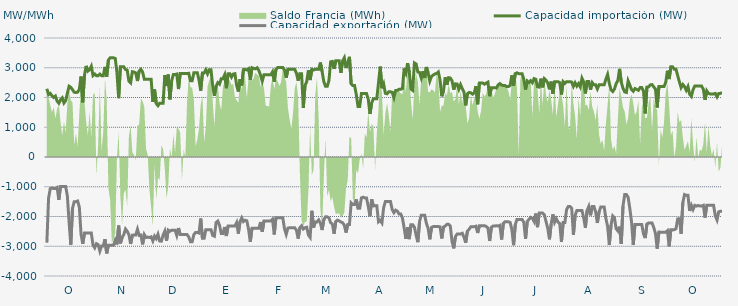
| Category | Capacidad importación (MW) | Capacidad exportación (MW) |
|---|---|---|
| 0 | 2293.75 | -2879.167 |
| 1900-01-01 | 2097.917 | -1387.5 |
| 1900-01-02 | 2137.5 | -1062.5 |
| 1900-01-03 | 2058.333 | -1041.667 |
| 1900-01-04 | 2002.083 | -1062.5 |
| 1900-01-05 | 2047.917 | -1062.5 |
| 1900-01-06 | 1879.167 | -1025 |
| 1900-01-07 | 1808.333 | -1437.5 |
| 1900-01-08 | 1925 | -987.5 |
| 1900-01-09 | 1987.5 | -987.5 |
| 1900-01-10 | 1816.667 | -987.5 |
| 1900-01-11 | 1895.833 | -987.5 |
| 1900-01-12 | 2141.708 | -1312.5 |
| 1900-01-13 | 2379.167 | -2187.5 |
| 1900-01-14 | 2341.667 | -2950 |
| 1900-01-15 | 2262.5 | -1725 |
| 1900-01-16 | 2179.167 | -1500 |
| 1900-01-17 | 2166.667 | -1500 |
| 1900-01-18 | 2179.167 | -1479.167 |
| 1900-01-19 | 2275 | -1687.5 |
| 1900-01-20 | 2704.167 | -2593.75 |
| 1900-01-21 | 1837.5 | -2920.833 |
| 1900-01-22 | 2750 | -2558.333 |
| 1900-01-23 | 3062.5 | -2558.333 |
| 1900-01-24 | 2887.5 | -2558.333 |
| 1900-01-25 | 2933.333 | -2558.333 |
| 1900-01-26 | 3050 | -2558.333 |
| 1900-01-27 | 2737.5 | -2956.25 |
| 1900-01-28 | 2788 | -3052 |
| 1900-01-29 | 2733.333 | -2912.5 |
| 1900-01-30 | 2733.333 | -2945.833 |
| 1900-01-31 | 2787.5 | -3162.5 |
| 1900-02-01 | 2733.333 | -2987.5 |
| 1900-02-02 | 2733.333 | -2987.5 |
| 1900-02-03 | 3029.167 | -2762.5 |
| 1900-02-04 | 2695.833 | -3239.583 |
| 1900-02-05 | 3258.333 | -2966.667 |
| 1900-02-06 | 3333.333 | -2966.667 |
| 1900-02-07 | 3333.333 | -2966.667 |
| 1900-02-08 | 3333.333 | -2966.667 |
| 1900-02-09 | 3312.5 | -2793.75 |
| 1900-02-10 | 2843.75 | -2937.5 |
| 1900-02-11 | 1977.083 | -2306.25 |
| 1900-02-12 | 3033.333 | -2904.167 |
| 1900-02-13 | 3033.333 | -2710.417 |
| 1900-02-14 | 3033.333 | -2608.333 |
| 1900-02-15 | 2939.583 | -2420.833 |
| 1900-02-16 | 2920.833 | -2495.833 |
| 1900-02-17 | 2550 | -2612.5 |
| 1900-02-18 | 2491.667 | -2922.917 |
| 1900-02-19 | 2866.667 | -2629.167 |
| 1900-02-20 | 2854.167 | -2618.75 |
| 1900-02-21 | 2825 | -2622.917 |
| 1900-02-22 | 2554.167 | -2429.167 |
| 1900-02-23 | 2891.667 | -2635.417 |
| 1900-02-24 | 2950 | -2622.917 |
| 1900-02-25 | 2858.333 | -2937.5 |
| 1900-02-26 | 2616.667 | -2608.333 |
| 1900-02-27 | 2616.667 | -2708.333 |
| 1900-02-28 | 2616.667 | -2691.667 |
| 1900-02-28 | 2616.667 | -2708.333 |
| 1900-03-01 | 2616.667 | -2683.333 |
| 1900-03-02 | 1850 | -2820.833 |
| 1900-03-03 | 2268.75 | -2658.333 |
| 1900-03-04 | 1795.833 | -2741.667 |
| 1900-03-05 | 1725 | -2595.833 |
| 1900-03-06 | 1808.333 | -2825 |
| 1900-03-07 | 1808.333 | -2829.167 |
| 1900-03-08 | 1808.333 | -2622.917 |
| 1900-03-09 | 2750 | -2491.667 |
| 1900-03-10 | 2385.417 | -2816.667 |
| 1900-03-11 | 2770.833 | -2458.333 |
| 1900-03-12 | 1937.5 | -2495.833 |
| 1900-03-13 | 2562.5 | -2458.333 |
| 1900-03-14 | 2770.833 | -2458.333 |
| 1900-03-15 | 2770.833 | -2458.333 |
| 1900-03-16 | 2787.5 | -2637.5 |
| 1900-03-17 | 2283.333 | -2387.5 |
| 1900-03-18 | 2808.333 | -2606.25 |
| 1900-03-19 | 2808.333 | -2606.25 |
| 1900-03-20 | 2808.333 | -2606.25 |
| 1900-03-21 | 2808.333 | -2606.25 |
| 1900-03-22 | 2808.333 | -2606.25 |
| 1900-03-23 | 2812.5 | -2687.5 |
| 1900-03-24 | 2562.5 | -2847.917 |
| 1900-03-25 | 2562.5 | -2847.917 |
| 1900-03-26 | 2833.333 | -2606.25 |
| 1900-03-27 | 2833.333 | -2535.417 |
| 1900-03-28 | 2833.333 | -2535.417 |
| 1900-03-29 | 2587.5 | -2556.25 |
| 1900-03-30 | 2229.167 | -2068.75 |
| 1900-03-31 | 2825 | -2729.167 |
| 1900-04-01 | 2825 | -2729.167 |
| 1900-04-02 | 2933.333 | -2441.667 |
| 1900-04-03 | 2795.833 | -2441.667 |
| 1900-04-04 | 2933.333 | -2441.667 |
| 1900-04-05 | 2933.333 | -2441.667 |
| 1900-04-06 | 2397.917 | -2637.5 |
| 1900-04-07 | 2056.25 | -2662.5 |
| 1900-04-08 | 2383.333 | -2202.083 |
| 1900-04-09 | 2500 | -2154.167 |
| 1900-04-10 | 2450 | -2293.75 |
| 1900-04-11 | 2633.333 | -2570.833 |
| 1900-04-12 | 2633.333 | -2570.833 |
| 1900-04-13 | 2762.5 | -2352.083 |
| 1900-04-14 | 2312.5 | -2656.25 |
| 1900-04-15 | 2800 | -2322.917 |
| 1900-04-16 | 2800 | -2322.917 |
| 1900-04-17 | 2683.333 | -2322.917 |
| 1900-04-18 | 2787.5 | -2322.917 |
| 1900-04-19 | 2800 | -2322.917 |
| 1900-04-20 | 2412.5 | -2206.25 |
| 1900-04-21 | 2200 | -2575 |
| 1900-04-22 | 2616.667 | -2170.833 |
| 1900-04-23 | 2404.167 | -2045.833 |
| 1900-04-24 | 2937.5 | -2170.833 |
| 1900-04-25 | 2941.667 | -2125 |
| 1900-04-26 | 2925 | -2145.833 |
| 1900-04-27 | 2968.75 | -2437.5 |
| 1900-04-28 | 2593.75 | -2854.167 |
| 1900-04-29 | 3000 | -2395.833 |
| 1900-04-30 | 2979.167 | -2395.833 |
| 1900-05-01 | 2964.583 | -2395.833 |
| 1900-05-02 | 3000 | -2395.833 |
| 1900-05-03 | 2906.25 | -2395.833 |
| 1900-05-04 | 2750 | -2187.5 |
| 1900-05-05 | 2550 | -2512.5 |
| 1900-05-06 | 2766.667 | -2154.167 |
| 1900-05-07 | 2766.667 | -2154.167 |
| 1900-05-08 | 2766.667 | -2154.167 |
| 1900-05-09 | 2766.667 | -2154.167 |
| 1900-05-10 | 2766.667 | -2154.167 |
| 1900-05-11 | 2862.5 | -2093.75 |
| 1900-05-12 | 2529.167 | -2604.167 |
| 1900-05-13 | 2945.833 | -2041.667 |
| 1900-05-14 | 3008.333 | -2041.667 |
| 1900-05-15 | 3008.333 | -2041.667 |
| 1900-05-16 | 3008.333 | -2041.667 |
| 1900-05-17 | 3008.333 | -2041.667 |
| 1900-05-18 | 2922.917 | -2412.5 |
| 1900-05-19 | 2662.5 | -2600 |
| 1900-05-20 | 2945.833 | -2389.583 |
| 1900-05-21 | 2945.833 | -2377.083 |
| 1900-05-22 | 2945.833 | -2377.083 |
| 1900-05-23 | 2945.833 | -2377.083 |
| 1900-05-24 | 2945.833 | -2379.167 |
| 1900-05-25 | 2812.5 | -2462.5 |
| 1900-05-26 | 2562.5 | -2741.667 |
| 1900-05-27 | 2802.083 | -2377.083 |
| 1900-05-28 | 2800 | -2312.5 |
| 1900-05-29 | 1650 | -2420.833 |
| 1900-05-30 | 2400 | -2379.167 |
| 1900-05-31 | 2533.333 | -2362.5 |
| 1900-06-01 | 2918.75 | -2622.917 |
| 1900-06-02 | 2587.5 | -2702.083 |
| 1900-06-03 | 2947.917 | -1808.333 |
| 1900-06-04 | 2922.917 | -2372.917 |
| 1900-06-05 | 2947.917 | -2181.25 |
| 1900-06-06 | 2947.917 | -2181.25 |
| 1900-06-07 | 2947.917 | -2114.583 |
| 1900-06-08 | 3175 | -2225 |
| 1900-06-09 | 2875 | -2454.167 |
| 1900-06-10 | 2535.417 | -2108.333 |
| 1900-06-11 | 2375 | -2012.5 |
| 1900-06-12 | 2375 | -2012.5 |
| 1900-06-13 | 2566.667 | -2043.75 |
| 1900-06-14 | 3200 | -2208.333 |
| 1900-06-15 | 3212.5 | -2250 |
| 1900-06-16 | 2962.5 | -2579.167 |
| 1900-06-17 | 3233.333 | -2166.667 |
| 1900-06-18 | 3233.333 | -2122.917 |
| 1900-06-19 | 3233.333 | -2145.833 |
| 1900-06-20 | 2829.167 | -2185.417 |
| 1900-06-21 | 3233.333 | -2208.333 |
| 1900-06-22 | 3337.5 | -2293.75 |
| 1900-06-23 | 2991.304 | -2541.304 |
| 1900-06-24 | 3183.333 | -2268.75 |
| 1900-06-25 | 3366.667 | -2268.75 |
| 1900-06-26 | 2454.583 | -1541.667 |
| 1900-06-27 | 2400 | -1600 |
| 1900-06-28 | 2400 | -1600 |
| 1900-06-29 | 2100 | -1425 |
| 1900-06-30 | 1700 | -1725 |
| 1900-07-01 | 1700 | -1725 |
| 1900-07-02 | 2133.333 | -1375 |
| 1900-07-03 | 2133.333 | -1350 |
| 1900-07-04 | 2133.333 | -1375 |
| 1900-07-05 | 2133.333 | -1375 |
| 1900-07-06 | 1943.75 | -1662.5 |
| 1900-07-07 | 1447.917 | -1991.667 |
| 1900-07-08 | 1820.833 | -1420.833 |
| 1900-07-09 | 1958.333 | -1645.833 |
| 1900-07-10 | 1958.333 | -1637.5 |
| 1900-07-11 | 1958.333 | -1637.5 |
| 1900-07-12 | 2502.083 | -2177.083 |
| 1900-07-13 | 3037.5 | -2129.167 |
| 1900-07-14 | 2312.5 | -2216.667 |
| 1900-07-15 | 2456.25 | -1702.083 |
| 1900-07-16 | 2141.667 | -1497.917 |
| 1900-07-17 | 2125 | -1497.917 |
| 1900-07-18 | 2191.667 | -1497.917 |
| 1900-07-19 | 2191.667 | -1497.917 |
| 1900-07-20 | 2175 | -1766.667 |
| 1900-07-21 | 1997.917 | -1870.833 |
| 1900-07-22 | 2233.333 | -1787.5 |
| 1900-07-23 | 2241.667 | -1818.75 |
| 1900-07-24 | 2275 | -1914.583 |
| 1900-07-25 | 2275 | -1914.583 |
| 1900-07-26 | 2304.167 | -2052.083 |
| 1900-07-27 | 2979.167 | -2385.417 |
| 1900-07-28 | 2825 | -2752.083 |
| 1900-07-29 | 3154.167 | -2358.333 |
| 1900-07-30 | 2850 | -2760.417 |
| 1900-07-31 | 2285.417 | -2275 |
| 1900-08-01 | 2239.583 | -2275 |
| 1900-08-02 | 3162.5 | -2358.333 |
| 1900-08-03 | 3127.083 | -2631.25 |
| 1900-08-04 | 2858.333 | -2862.5 |
| 1900-08-05 | 2841.667 | -2166.667 |
| 1900-08-06 | 2656.25 | -1956.25 |
| 1900-08-07 | 2883.333 | -1956.25 |
| 1900-08-08 | 2656.25 | -1956.25 |
| 1900-08-09 | 3025 | -2229.167 |
| 1900-08-10 | 2831.25 | -2393.75 |
| 1900-08-11 | 2550.625 | -2766.667 |
| 1900-08-12 | 2710.417 | -2368.75 |
| 1900-08-13 | 2754.167 | -2337.5 |
| 1900-08-14 | 2791.667 | -2337.5 |
| 1900-08-15 | 2808.333 | -2337.5 |
| 1900-08-16 | 2858.333 | -2337.5 |
| 1900-08-17 | 2581.25 | -2347.917 |
| 1900-08-18 | 2041.667 | -2737.5 |
| 1900-08-19 | 2218.75 | -2354.167 |
| 1900-08-20 | 2679.167 | -2320.833 |
| 1900-08-21 | 2427.083 | -2260.417 |
| 1900-08-22 | 2666.667 | -2260.417 |
| 1900-08-23 | 2654.167 | -2320.833 |
| 1900-08-24 | 2562.5 | -2837.5 |
| 1900-08-25 | 2264.583 | -3070.833 |
| 1900-08-26 | 2458.333 | -2672.917 |
| 1900-08-27 | 2454.167 | -2585.417 |
| 1900-08-28 | 2279.167 | -2585.417 |
| 1900-08-29 | 2431.25 | -2585.417 |
| 1900-08-30 | 2295.833 | -2562.5 |
| 1900-08-31 | 2181.25 | -2700 |
| 1900-09-01 | 1735.417 | -2883.333 |
| 1900-09-02 | 2125 | -2487.5 |
| 1900-09-03 | 2170.833 | -2429.167 |
| 1900-09-04 | 2158.333 | -2341.667 |
| 1900-09-05 | 2112.5 | -2341.667 |
| 1900-09-06 | 2158.333 | -2341.667 |
| 1900-09-07 | 2383.333 | -2325 |
| 1900-09-08 | 1772.917 | -2554.167 |
| 1900-09-09 | 2485.417 | -2308.333 |
| 1900-09-10 | 2485.417 | -2308.333 |
| 1900-09-11 | 2485.417 | -2308.333 |
| 1900-09-12 | 2447.917 | -2308.333 |
| 1900-09-13 | 2485.417 | -2333.333 |
| 1900-09-14 | 2516.667 | -2387.5 |
| 1900-09-15 | 2043.75 | -2822.917 |
| 1900-09-16 | 2331.25 | -2362.5 |
| 1900-09-17 | 2331.25 | -2320.833 |
| 1900-09-18 | 2331.25 | -2320.833 |
| 1900-09-19 | 2318.75 | -2308.333 |
| 1900-09-20 | 2425 | -2320.833 |
| 1900-09-21 | 2468.75 | -2295.833 |
| 1900-09-22 | 2418.75 | -2772.917 |
| 1900-09-23 | 2400 | -2235.417 |
| 1900-09-24 | 2400 | -2179.167 |
| 1900-09-25 | 2366.667 | -2179.167 |
| 1900-09-26 | 2366.667 | -2179.167 |
| 1900-09-27 | 2404.167 | -2200 |
| 1900-09-28 | 2743.75 | -2437.5 |
| 1900-09-29 | 2393.75 | -2964.583 |
| 1900-09-30 | 2804.167 | -2270.833 |
| 1900-10-01 | 2829.167 | -2097.917 |
| 1900-10-02 | 2800 | -2097.917 |
| 1900-10-03 | 2800 | -2097.917 |
| 1900-10-04 | 2800 | -2097.917 |
| 1900-10-05 | 2610.417 | -2200 |
| 1900-10-06 | 2264.583 | -2750 |
| 1900-10-07 | 2556.25 | -2166.667 |
| 1900-10-08 | 2506.25 | -2095.833 |
| 1900-10-09 | 2564.583 | -2029.167 |
| 1900-10-10 | 2497.917 | -2058.333 |
| 1900-10-11 | 2635.417 | -2166.667 |
| 1900-10-12 | 2612.5 | -1900 |
| 1900-10-13 | 2362.5 | -2358.333 |
| 1900-10-14 | 2350 | -1885.417 |
| 1900-10-15 | 2633.333 | -1885.417 |
| 1900-10-16 | 2341.667 | -1885.417 |
| 1900-10-17 | 2633.333 | -1943.75 |
| 1900-10-18 | 2579.167 | -2168.75 |
| 1900-10-19 | 2485.417 | -2400 |
| 1900-10-20 | 2275 | -2766.667 |
| 1900-10-21 | 2533.333 | -2252.083 |
| 1900-10-22 | 2125 | -1929.167 |
| 1900-10-23 | 2533.333 | -2195.833 |
| 1900-10-24 | 2533.333 | -2072.917 |
| 1900-10-25 | 2533.333 | -2187.5 |
| 1900-10-26 | 2500 | -2237.5 |
| 1900-10-27 | 2100 | -2856.25 |
| 1900-10-28 | 2533.333 | -2202.083 |
| 1900-10-29 | 2475 | -2202.083 |
| 1900-10-30 | 2533.333 | -1768.75 |
| 1900-10-31 | 2533.333 | -1662.5 |
| 1900-11-01 | 2533.333 | -1662.5 |
| 1900-11-02 | 2518.75 | -1725 |
| 1900-11-03 | 2375 | -2614.583 |
| 1900-11-04 | 2495.833 | -1964.583 |
| 1900-11-05 | 2383.333 | -1800 |
| 1900-11-06 | 2466.667 | -1800 |
| 1900-11-07 | 2358.333 | -1800 |
| 1900-11-08 | 2650 | -1800 |
| 1900-11-09 | 2525 | -2037.5 |
| 1900-11-10 | 2135.417 | -2381.25 |
| 1900-11-11 | 2537.5 | -1800 |
| 1900-11-12 | 2537.5 | -1662.5 |
| 1900-11-13 | 2260.417 | -1960.417 |
| 1900-11-14 | 2500 | -1662.5 |
| 1900-11-15 | 2425 | -1662.5 |
| 1900-11-16 | 2425 | -1843.75 |
| 1900-11-17 | 2287.5 | -2216.667 |
| 1900-11-18 | 2425 | -1843.75 |
| 1900-11-19 | 2425 | -1681.25 |
| 1900-11-20 | 2425 | -1681.25 |
| 1900-11-21 | 2425 | -1681.25 |
| 1900-11-22 | 2616.667 | -2062.5 |
| 1900-11-23 | 2775 | -2329.167 |
| 1900-11-24 | 2475 | -2956.25 |
| 1900-11-25 | 2258.333 | -2293.75 |
| 1900-11-26 | 2200 | -1981.25 |
| 1900-11-27 | 2283.333 | -2043.75 |
| 1900-11-28 | 2466.667 | -2410.417 |
| 1900-11-29 | 2570.833 | -2485.417 |
| 1900-11-30 | 2962.5 | -2341.667 |
| 1900-12-01 | 2512.5 | -2920.833 |
| 1900-12-02 | 2308.333 | -1650 |
| 1900-12-03 | 2187.5 | -1262.5 |
| 1900-12-04 | 2170.833 | -1262.5 |
| 1900-12-05 | 2558.333 | -1352.083 |
| 1900-12-06 | 2416.667 | -1731.25 |
| 1900-12-07 | 2266.667 | -2175 |
| 1900-12-08 | 2208.333 | -2956.25 |
| 1900-12-09 | 2300 | -2268.75 |
| 1900-12-10 | 2275 | -2266.667 |
| 1900-12-11 | 2241.667 | -2266.667 |
| 1900-12-12 | 2333.333 | -2266.667 |
| 1900-12-13 | 2333.333 | -2270.833 |
| 1900-12-14 | 2212.5 | -2581.25 |
| 1900-12-15 | 1464.583 | -2725 |
| 1900-12-16 | 2350 | -2250 |
| 1900-12-17 | 2358.333 | -2218.75 |
| 1900-12-18 | 2425 | -2218.75 |
| 1900-12-19 | 2433.333 | -2218.75 |
| 1900-12-20 | 2354.167 | -2368.75 |
| 1900-12-21 | 2279.167 | -2575 |
| 1900-12-22 | 1662.5 | -3079.167 |
| 1900-12-23 | 2366.667 | -2522.917 |
| 1900-12-24 | 2366.667 | -2527.083 |
| 1900-12-25 | 2366.667 | -2527.083 |
| 1900-12-26 | 2366.667 | -2527.083 |
| 1900-12-27 | 2508.333 | -2527.083 |
| 1900-12-28 | 2900 | -2477.083 |
| 1900-12-29 | 2620.833 | -3004.167 |
| 1900-12-30 | 3033.333 | -2443.75 |
| 1900-12-31 | 3033.333 | -2443.75 |
| 1901-01-01 | 2950 | -2443.75 |
| 1901-01-02 | 2950 | -2410.417 |
| 1901-01-03 | 2735.417 | -2081.25 |
| 1901-01-04 | 2525 | -2075 |
| 1901-01-05 | 2332.667 | -2579.167 |
| 1901-01-06 | 2437.5 | -1537.5 |
| 1901-01-07 | 2366.667 | -1262.5 |
| 1901-01-08 | 2241.667 | -1287.5 |
| 1901-01-09 | 2366.667 | -1287.5 |
| 1901-01-10 | 2108.333 | -1814.583 |
| 1901-01-11 | 2039.583 | -1625 |
| 1901-01-12 | 2264.583 | -1762.5 |
| 1901-01-13 | 2383.333 | -1625 |
| 1901-01-14 | 2383.333 | -1650 |
| 1901-01-15 | 2383.333 | -1629.167 |
| 1901-01-16 | 2383.333 | -1650 |
| 1901-01-17 | 2383.333 | -1650 |
| 1901-01-18 | 2275 | -1625 |
| 1901-01-19 | 1918.75 | -2037.5 |
| 1901-01-20 | 2225 | -1625 |
| 1901-01-21 | 2138.417 | -1625 |
| 1901-01-22 | 2120.833 | -1625 |
| 1901-01-23 | 2120.833 | -1625 |
| 1901-01-24 | 2120.833 | -1625 |
| 1901-01-25 | 2137.5 | -1975 |
| 1901-01-26 | 2020 | -2116 |
| 1901-01-27 | 2137.5 | -1841.667 |
| 1901-01-28 | 2137.5 | -1825 |
| 1901-01-29 | 2170.833 | -1825 |